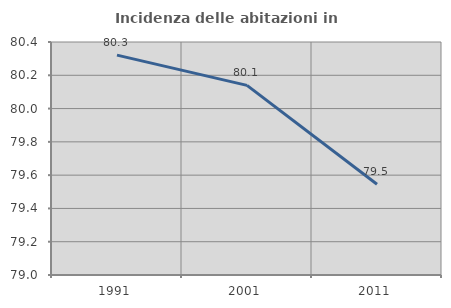
| Category | Incidenza delle abitazioni in proprietà  |
|---|---|
| 1991.0 | 80.321 |
| 2001.0 | 80.139 |
| 2011.0 | 79.545 |